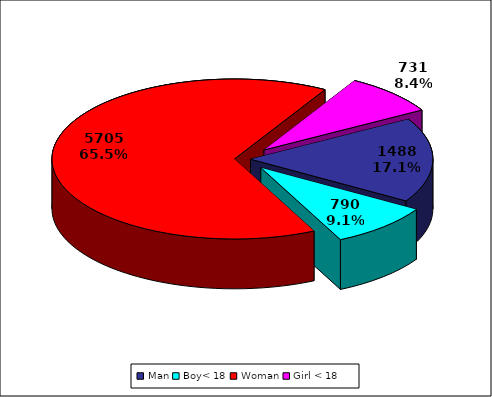
| Category | TOTAL |
|---|---|
| Man | 1488 |
| Boy< 18 | 790 |
| Woman | 5705 |
| Girl < 18 | 731 |